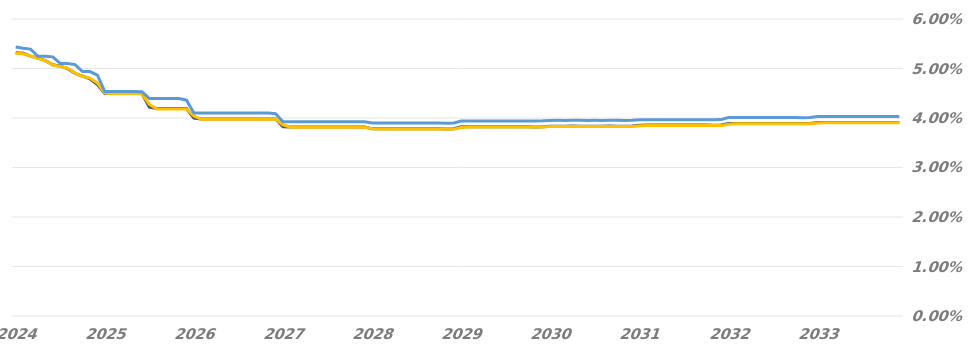
| Category | Resets |
|---|---|
| 2024-04-15 | 0.054 |
| 2024-05-15 | 0.054 |
| 2024-06-15 | 0.054 |
| 2024-07-15 | 0.052 |
| 2024-08-15 | 0.052 |
| 2024-09-15 | 0.052 |
| 2024-10-15 | 0.051 |
| 2024-11-15 | 0.051 |
| 2024-12-15 | 0.051 |
| 2025-01-15 | 0.049 |
| 2025-02-15 | 0.049 |
| 2025-03-15 | 0.049 |
| 2025-04-15 | 0.045 |
| 2025-05-15 | 0.045 |
| 2025-06-15 | 0.045 |
| 2025-07-15 | 0.045 |
| 2025-08-15 | 0.045 |
| 2025-09-15 | 0.045 |
| 2025-10-15 | 0.044 |
| 2025-11-15 | 0.044 |
| 2025-12-15 | 0.044 |
| 2026-01-15 | 0.044 |
| 2026-02-15 | 0.044 |
| 2026-03-15 | 0.044 |
| 2026-04-15 | 0.041 |
| 2026-05-15 | 0.041 |
| 2026-06-15 | 0.041 |
| 2026-07-15 | 0.041 |
| 2026-08-15 | 0.041 |
| 2026-09-15 | 0.041 |
| 2026-10-15 | 0.041 |
| 2026-11-15 | 0.041 |
| 2026-12-15 | 0.041 |
| 2027-01-15 | 0.041 |
| 2027-02-15 | 0.041 |
| 2027-03-15 | 0.041 |
| 2027-04-15 | 0.039 |
| 2027-05-15 | 0.039 |
| 2027-06-15 | 0.039 |
| 2027-07-15 | 0.039 |
| 2027-08-15 | 0.039 |
| 2027-09-15 | 0.039 |
| 2027-10-15 | 0.039 |
| 2027-11-15 | 0.039 |
| 2027-12-15 | 0.039 |
| 2028-01-15 | 0.039 |
| 2028-02-15 | 0.039 |
| 2028-03-15 | 0.039 |
| 2028-04-15 | 0.039 |
| 2028-05-15 | 0.039 |
| 2028-06-15 | 0.039 |
| 2028-07-15 | 0.039 |
| 2028-08-15 | 0.039 |
| 2028-09-15 | 0.039 |
| 2028-10-15 | 0.039 |
| 2028-11-15 | 0.039 |
| 2028-12-15 | 0.039 |
| 2029-01-15 | 0.039 |
| 2029-02-15 | 0.039 |
| 2029-03-15 | 0.039 |
| 2029-04-15 | 0.039 |
| 2029-05-15 | 0.039 |
| 2029-06-15 | 0.039 |
| 2029-07-15 | 0.039 |
| 2029-08-15 | 0.039 |
| 2029-09-15 | 0.039 |
| 2029-10-15 | 0.039 |
| 2029-11-15 | 0.039 |
| 2029-12-15 | 0.039 |
| 2030-01-15 | 0.039 |
| 2030-02-15 | 0.039 |
| 2030-03-15 | 0.039 |
| 2030-04-15 | 0.04 |
| 2030-05-15 | 0.04 |
| 2030-06-15 | 0.04 |
| 2030-07-15 | 0.04 |
| 2030-08-15 | 0.04 |
| 2030-09-15 | 0.04 |
| 2030-10-15 | 0.04 |
| 2030-11-15 | 0.04 |
| 2030-12-15 | 0.04 |
| 2031-01-15 | 0.04 |
| 2031-02-15 | 0.04 |
| 2031-03-15 | 0.04 |
| 2031-04-15 | 0.04 |
| 2031-05-15 | 0.04 |
| 2031-06-15 | 0.04 |
| 2031-07-15 | 0.04 |
| 2031-08-15 | 0.04 |
| 2031-09-15 | 0.04 |
| 2031-10-15 | 0.04 |
| 2031-11-15 | 0.04 |
| 2031-12-15 | 0.04 |
| 2032-01-15 | 0.04 |
| 2032-02-15 | 0.04 |
| 2032-03-15 | 0.04 |
| 2032-04-15 | 0.04 |
| 2032-05-15 | 0.04 |
| 2032-06-15 | 0.04 |
| 2032-07-15 | 0.04 |
| 2032-08-15 | 0.04 |
| 2032-09-15 | 0.04 |
| 2032-10-15 | 0.04 |
| 2032-11-15 | 0.04 |
| 2032-12-15 | 0.04 |
| 2033-01-15 | 0.04 |
| 2033-02-15 | 0.04 |
| 2033-03-15 | 0.04 |
| 2033-04-15 | 0.04 |
| 2033-05-15 | 0.04 |
| 2033-06-15 | 0.04 |
| 2033-07-15 | 0.04 |
| 2033-08-15 | 0.04 |
| 2033-09-15 | 0.04 |
| 2033-10-15 | 0.04 |
| 2033-11-15 | 0.04 |
| 2033-12-15 | 0.04 |
| 2034-01-15 | 0.04 |
| 2034-02-15 | 0.04 |
| 2034-03-15 | 0.04 |